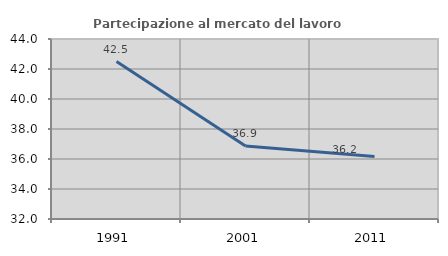
| Category | Partecipazione al mercato del lavoro  femminile |
|---|---|
| 1991.0 | 42.5 |
| 2001.0 | 36.871 |
| 2011.0 | 36.164 |